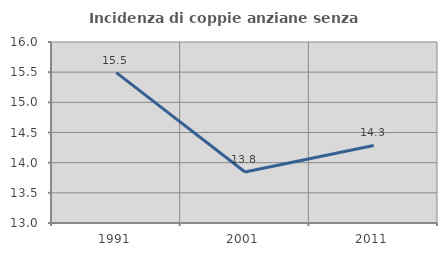
| Category | Incidenza di coppie anziane senza figli  |
|---|---|
| 1991.0 | 15.493 |
| 2001.0 | 13.846 |
| 2011.0 | 14.286 |